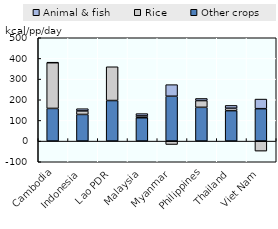
| Category | Other crops | Rice | Animal & fish |
|---|---|---|---|
| Cambodia | 158.084 | 221.309 | 1.86 |
| Indonesia | 128.973 | 16.975 | 10.754 |
| Lao PDR | 196.267 | 163.34 | 0 |
| Malaysia | 113.004 | 8.806 | 11.148 |
| Myanmar | 217.023 | -16.558 | 56.083 |
| Philippines | 163.37 | 32.626 | 10.271 |
| Thailand | 147.308 | 11.764 | 13.496 |
| Viet Nam | 156.789 | -48.488 | 46.489 |